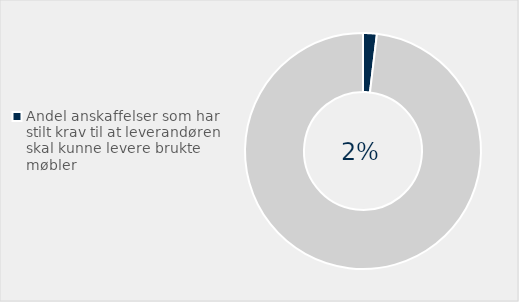
| Category | Series 0 |
|---|---|
| Andel anskaffelser som har stilt krav til at leverandøren skal kunne levere brukte møbler | 0.019 |
| Ikke stilt krav  | 0.981 |